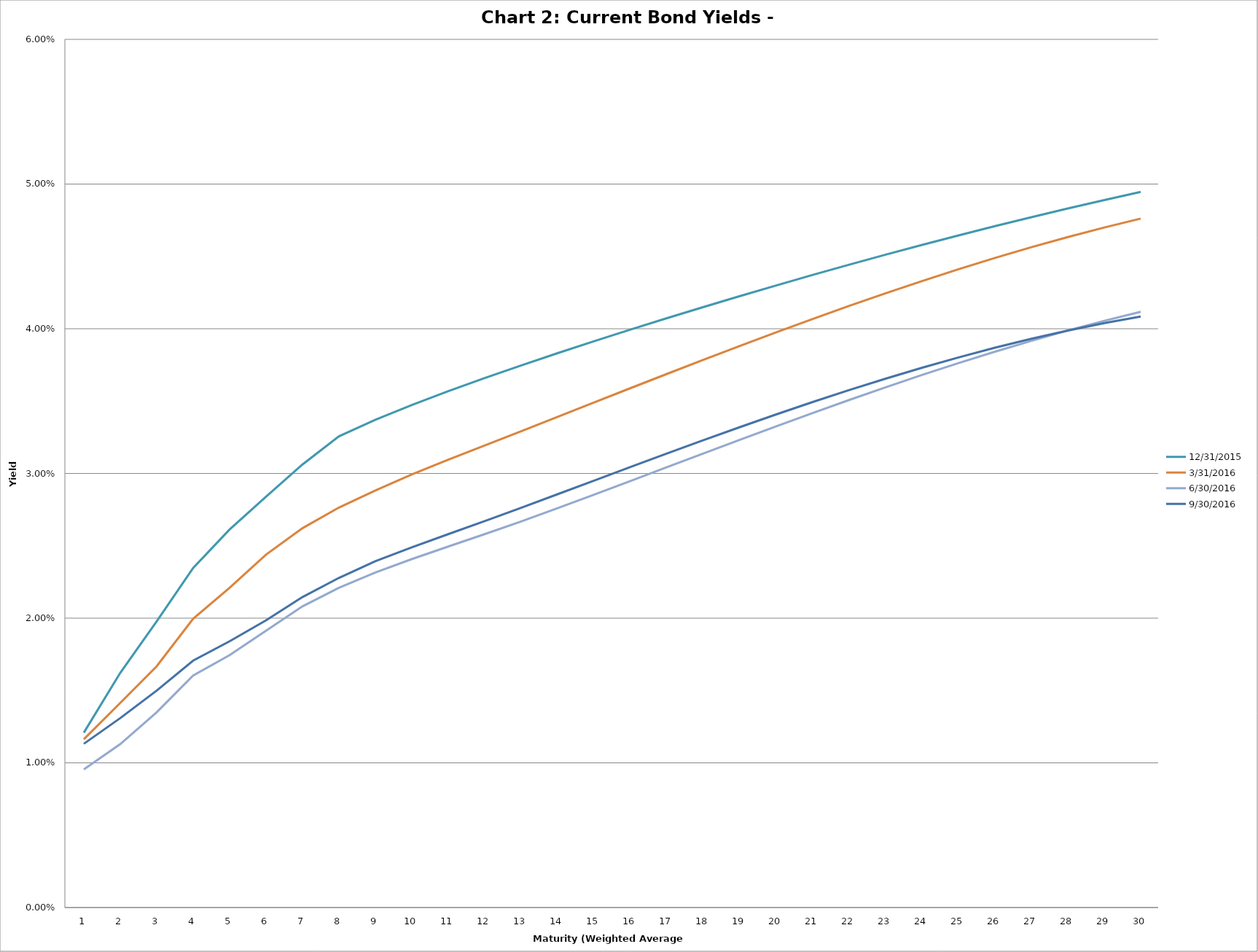
| Category | 12/31/2015 | 3/31/2016 | 6/30/2016 | 9/30/2016 |
|---|---|---|---|---|
| 0 | 0.012 | 0.012 | 0.01 | 0.011 |
| 1 | 0.016 | 0.014 | 0.011 | 0.013 |
| 2 | 0.02 | 0.017 | 0.013 | 0.015 |
| 3 | 0.023 | 0.02 | 0.016 | 0.017 |
| 4 | 0.026 | 0.022 | 0.017 | 0.018 |
| 5 | 0.028 | 0.024 | 0.019 | 0.02 |
| 6 | 0.031 | 0.026 | 0.021 | 0.021 |
| 7 | 0.033 | 0.028 | 0.022 | 0.023 |
| 8 | 0.034 | 0.029 | 0.023 | 0.024 |
| 9 | 0.035 | 0.03 | 0.024 | 0.025 |
| 10 | 0.036 | 0.031 | 0.025 | 0.026 |
| 11 | 0.037 | 0.032 | 0.026 | 0.027 |
| 12 | 0.037 | 0.033 | 0.027 | 0.028 |
| 13 | 0.038 | 0.034 | 0.028 | 0.029 |
| 14 | 0.039 | 0.035 | 0.029 | 0.03 |
| 15 | 0.04 | 0.036 | 0.029 | 0.03 |
| 16 | 0.041 | 0.037 | 0.03 | 0.031 |
| 17 | 0.042 | 0.038 | 0.031 | 0.032 |
| 18 | 0.042 | 0.039 | 0.032 | 0.033 |
| 19 | 0.043 | 0.04 | 0.033 | 0.034 |
| 20 | 0.044 | 0.041 | 0.034 | 0.035 |
| 21 | 0.044 | 0.042 | 0.035 | 0.036 |
| 22 | 0.045 | 0.042 | 0.036 | 0.037 |
| 23 | 0.046 | 0.043 | 0.037 | 0.037 |
| 24 | 0.046 | 0.044 | 0.038 | 0.038 |
| 25 | 0.047 | 0.045 | 0.038 | 0.039 |
| 26 | 0.048 | 0.046 | 0.039 | 0.039 |
| 27 | 0.048 | 0.046 | 0.04 | 0.04 |
| 28 | 0.049 | 0.047 | 0.041 | 0.04 |
| 29 | 0.049 | 0.048 | 0.041 | 0.041 |